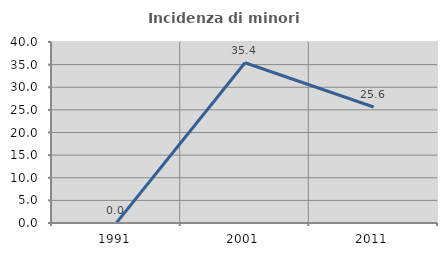
| Category | Incidenza di minori stranieri |
|---|---|
| 1991.0 | 0 |
| 2001.0 | 35.417 |
| 2011.0 | 25.641 |